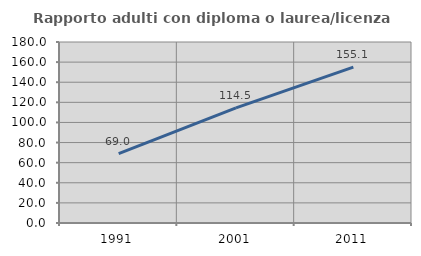
| Category | Rapporto adulti con diploma o laurea/licenza media  |
|---|---|
| 1991.0 | 68.969 |
| 2001.0 | 114.463 |
| 2011.0 | 155.095 |